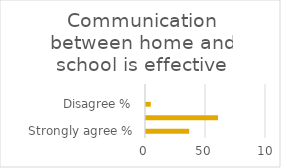
| Category | Series 1 |
|---|---|
| Strongly agree % | 36 |
| Agree % | 60 |
| Disagree % | 4 |
| Strongly disagree % | 0 |